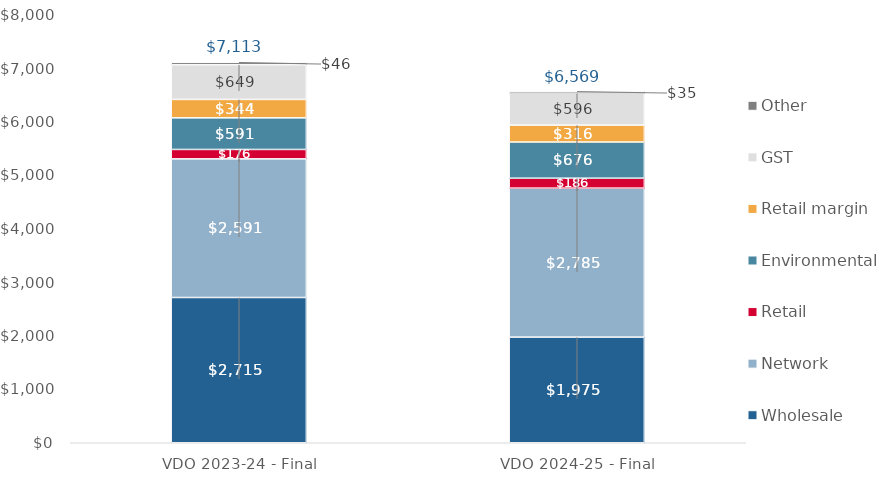
| Category | Wholesale | Network | Retail | Environmental | Retail margin | GST | Other |
|---|---|---|---|---|---|---|---|
| VDO 2023-24 - Final | 2715.103 | 2591.295 | 175.924 | 590.776 | 344.265 | 649.185 | 46.223 |
| VDO 2024-25 - Final | 1974.526 | 2784.732 | 185.868 | 676.084 | 316.048 | 595.977 | 35.399 |